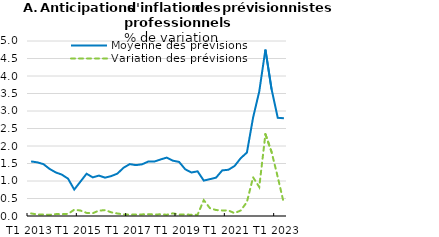
| Category | Moyenne des prévisions | Variation des prévisions |
|---|---|---|
| T1 2013 | 1.559 | 0.074 |
| T2 2013 | 1.533 | 0.043 |
| T3 2013 | 1.483 | 0.045 |
| T4 2013 | 1.345 | 0.034 |
| T1 2014 | 1.245 | 0.053 |
| T2 2014 | 1.182 | 0.054 |
| T3 2014 | 1.066 | 0.06 |
| T4 2014 | 0.755 | 0.18 |
| T1 2015 | 0.982 | 0.157 |
| T2 2015 | 1.208 | 0.089 |
| T3 2015 | 1.104 | 0.08 |
| T4 2015 | 1.155 | 0.154 |
| T1 2016 | 1.096 | 0.167 |
| T2 2016 | 1.14 | 0.106 |
| T3 2016 | 1.212 | 0.072 |
| T4 2016 | 1.38 | 0.045 |
| T1 2017 | 1.482 | 0.038 |
| T2 2017 | 1.454 | 0.041 |
| T3 2017 | 1.477 | 0.046 |
| T4 2017 | 1.556 | 0.053 |
| T1 2018 | 1.555 | 0.043 |
| T2 2018 | 1.616 | 0.048 |
| T3 2018 | 1.669 | 0.037 |
| T4 2018 | 1.581 | 0.076 |
| T1 2019 | 1.545 | 0.039 |
| T2 2019 | 1.335 | 0.046 |
| T3 2019 | 1.242 | 0.034 |
| T4 2019 | 1.277 | 0.036 |
| T1 2020 | 1.012 | 0.453 |
| T2 2020 | 1.053 | 0.225 |
| T3 2020 | 1.097 | 0.17 |
| T4 2020 | 1.304 | 0.159 |
| T1 2021 | 1.321 | 0.157 |
| T2 2021 | 1.429 | 0.082 |
| T3 2021 | 1.653 | 0.159 |
| T4 2021 | 1.813 | 0.397 |
| T1 2022 | 2.811 | 1.106 |
| T2 2022 | 3.557 | 0.827 |
| T3 2022 | 4.756 | 2.338 |
| T4 2022 | 3.621 | 1.827 |
| T1 2023 | 2.806 | 1.114 |
| T2 2023 | 2.791 | 0.352 |